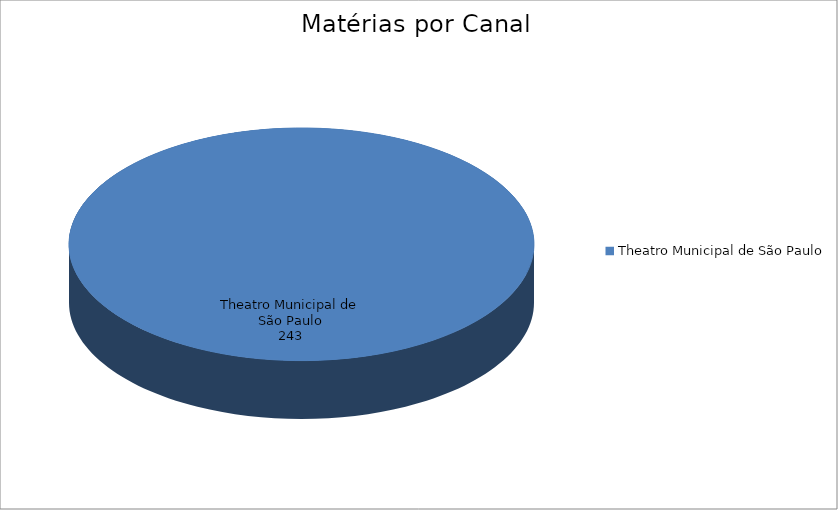
| Category | Series 0 |
|---|---|
| Theatro Municipal de São Paulo | 243 |